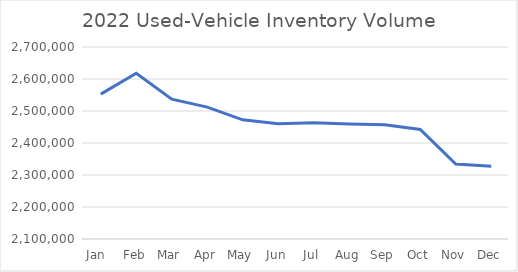
| Category | Series 0 |
|---|---|
| Jan  | 2552742 |
| Feb | 2618096 |
| Mar | 2536877 |
| Apr | 2512274 |
| May | 2472300 |
| Jun | 2460005 |
| Jul | 2463625 |
| Aug | 2459590 |
| Sep | 2457110 |
| Oct | 2442118 |
| Nov | 2334143 |
| Dec | 2326984 |